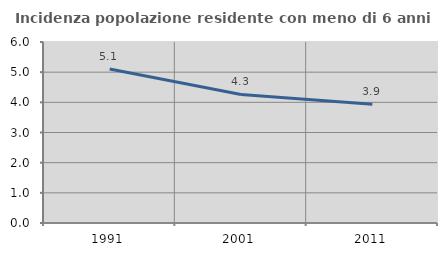
| Category | Incidenza popolazione residente con meno di 6 anni |
|---|---|
| 1991.0 | 5.106 |
| 2001.0 | 4.261 |
| 2011.0 | 3.933 |